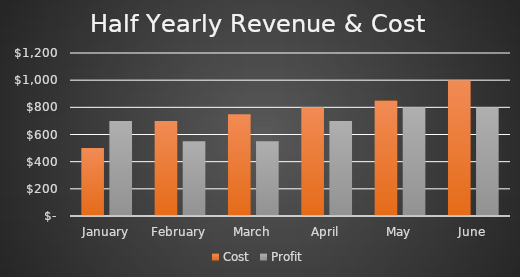
| Category | Cost | Profit |
|---|---|---|
| January | 500 | 700 |
| February | 700 | 550 |
| March | 750 | 550 |
| April | 800 | 700 |
| May | 850 | 800 |
| June | 1000 | 800 |